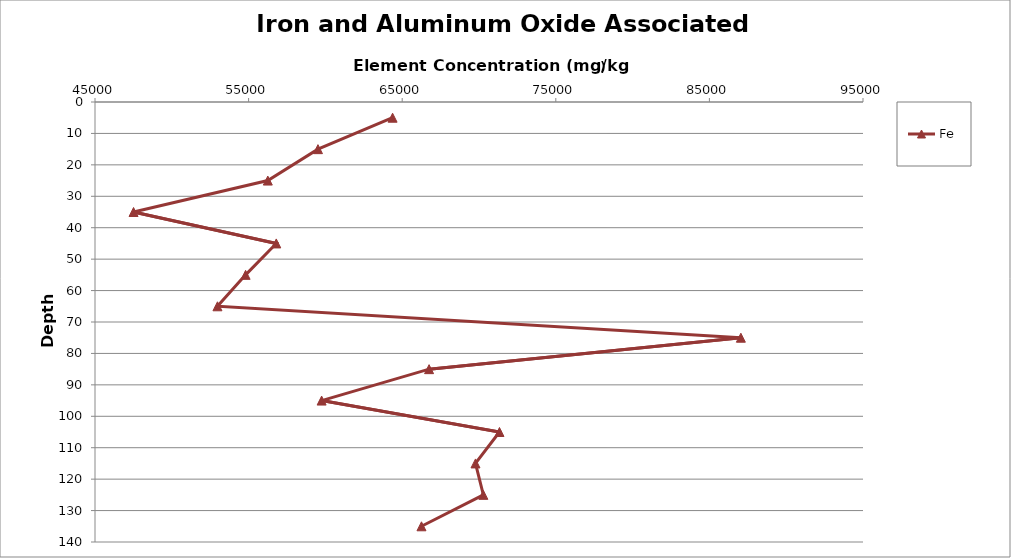
| Category | Fe |
|---|---|
| 64374.34269644138 | 5 |
| 59516.960363720835 | 15 |
| 56250.554859214484 | 25 |
| 47509.90489000312 | 35 |
| 56801.36491983478 | 45 |
| 54804.48996253686 | 55 |
| 52972.26550281308 | 65 |
| 87048.82126567884 | 75 |
| 66749.77716130445 | 85 |
| 59755.043614264374 | 95 |
| 71332.53216935464 | 105 |
| 69771.43426869655 | 115 |
| 70283.82411506014 | 125 |
| 66254.65795400036 | 135 |